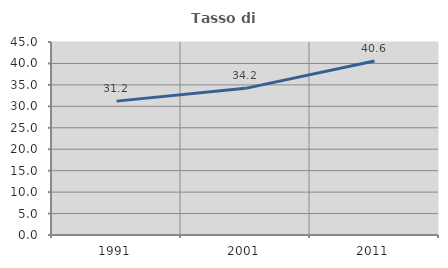
| Category | Tasso di occupazione   |
|---|---|
| 1991.0 | 31.214 |
| 2001.0 | 34.194 |
| 2011.0 | 40.573 |